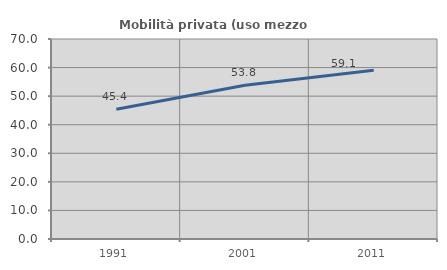
| Category | Mobilità privata (uso mezzo privato) |
|---|---|
| 1991.0 | 45.382 |
| 2001.0 | 53.846 |
| 2011.0 | 59.091 |